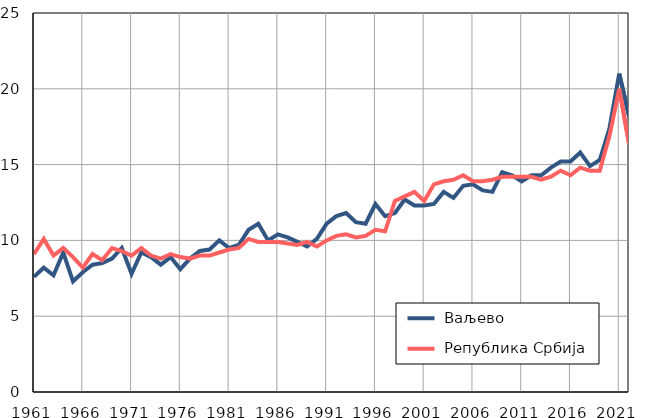
| Category |  Ваљево |  Република Србија |
|---|---|---|
| 1961.0 | 7.6 | 9.1 |
| 1962.0 | 8.2 | 10.1 |
| 1963.0 | 7.7 | 9 |
| 1964.0 | 9.2 | 9.5 |
| 1965.0 | 7.3 | 8.9 |
| 1966.0 | 7.9 | 8.2 |
| 1967.0 | 8.4 | 9.1 |
| 1968.0 | 8.5 | 8.7 |
| 1969.0 | 8.8 | 9.5 |
| 1970.0 | 9.5 | 9.3 |
| 1971.0 | 7.8 | 9 |
| 1972.0 | 9.2 | 9.5 |
| 1973.0 | 8.9 | 9 |
| 1974.0 | 8.4 | 8.8 |
| 1975.0 | 8.9 | 9.1 |
| 1976.0 | 8.1 | 8.9 |
| 1977.0 | 8.8 | 8.8 |
| 1978.0 | 9.3 | 9 |
| 1979.0 | 9.4 | 9 |
| 1980.0 | 10 | 9.2 |
| 1981.0 | 9.5 | 9.4 |
| 1982.0 | 9.7 | 9.5 |
| 1983.0 | 10.7 | 10.1 |
| 1984.0 | 11.1 | 9.9 |
| 1985.0 | 10 | 9.9 |
| 1986.0 | 10.4 | 9.9 |
| 1987.0 | 10.2 | 9.8 |
| 1988.0 | 9.9 | 9.7 |
| 1989.0 | 9.6 | 9.9 |
| 1990.0 | 10.1 | 9.6 |
| 1991.0 | 11.1 | 10 |
| 1992.0 | 11.6 | 10.3 |
| 1993.0 | 11.8 | 10.4 |
| 1994.0 | 11.2 | 10.2 |
| 1995.0 | 11.1 | 10.3 |
| 1996.0 | 12.4 | 10.7 |
| 1997.0 | 11.6 | 10.6 |
| 1998.0 | 11.8 | 12.6 |
| 1999.0 | 12.7 | 12.9 |
| 2000.0 | 12.3 | 13.2 |
| 2001.0 | 12.3 | 12.6 |
| 2002.0 | 12.4 | 13.7 |
| 2003.0 | 13.2 | 13.9 |
| 2004.0 | 12.8 | 14 |
| 2005.0 | 13.6 | 14.3 |
| 2006.0 | 13.7 | 13.9 |
| 2007.0 | 13.3 | 13.9 |
| 2008.0 | 13.2 | 14 |
| 2009.0 | 14.5 | 14.2 |
| 2010.0 | 14.3 | 14.2 |
| 2011.0 | 13.9 | 14.2 |
| 2012.0 | 14.3 | 14.2 |
| 2013.0 | 14.3 | 14 |
| 2014.0 | 14.8 | 14.2 |
| 2015.0 | 15.2 | 14.6 |
| 2016.0 | 15.2 | 14.3 |
| 2017.0 | 15.8 | 14.8 |
| 2018.0 | 14.9 | 14.6 |
| 2019.0 | 15.3 | 14.6 |
| 2020.0 | 17.4 | 16.9 |
| 2021.0 | 21 | 20 |
| 2022.0 | 18.2 | 16.4 |